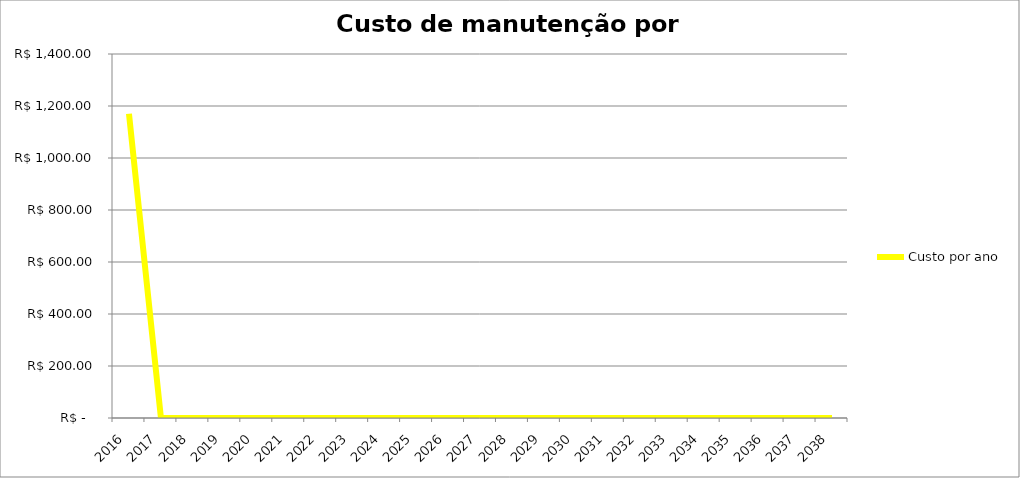
| Category | Custo por ano |
|---|---|
| 2016.0 | 1170 |
| 2017.0 | 0 |
| 2018.0 | 0 |
| 2019.0 | 0 |
| 2020.0 | 0 |
| 2021.0 | 0 |
| 2022.0 | 0 |
| 2023.0 | 0 |
| 2024.0 | 0 |
| 2025.0 | 0 |
| 2026.0 | 0 |
| 2027.0 | 0 |
| 2028.0 | 0 |
| 2029.0 | 0 |
| 2030.0 | 0 |
| 2031.0 | 0 |
| 2032.0 | 0 |
| 2033.0 | 0 |
| 2034.0 | 0 |
| 2035.0 | 0 |
| 2036.0 | 0 |
| 2037.0 | 0 |
| 2038.0 | 0 |